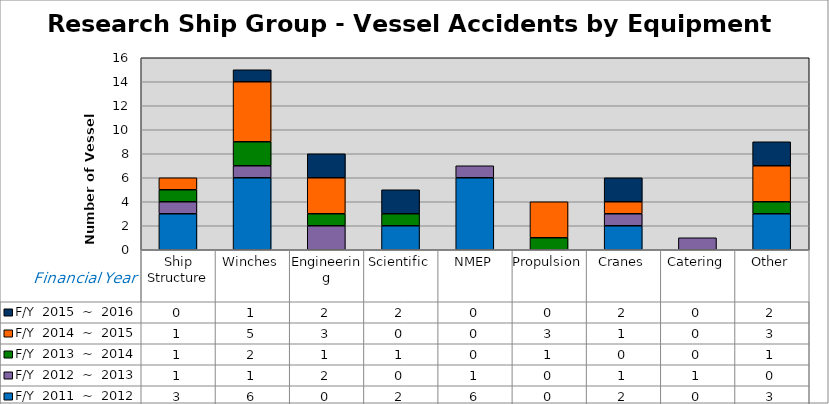
| Category | F/Y  2011  ~  2012 | F/Y  2012  ~  2013 | F/Y  2013  ~  2014 | F/Y  2014  ~  2015 | F/Y  2015  ~  2016 |
|---|---|---|---|---|---|
| Ship Structure | 3 | 1 | 1 | 1 | 0 |
| Winches | 6 | 1 | 2 | 5 | 1 |
| Engineering | 0 | 2 | 1 | 3 | 2 |
| Scientific | 2 | 0 | 1 | 0 | 2 |
| NMEP | 6 | 1 | 0 | 0 | 0 |
| Propulsion | 0 | 0 | 1 | 3 | 0 |
| Cranes | 2 | 1 | 0 | 1 | 2 |
| Catering | 0 | 1 | 0 | 0 | 0 |
| Other | 3 | 0 | 1 | 3 | 2 |